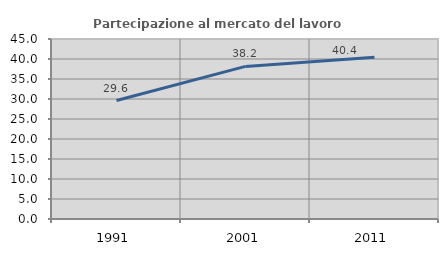
| Category | Partecipazione al mercato del lavoro  femminile |
|---|---|
| 1991.0 | 29.624 |
| 2001.0 | 38.15 |
| 2011.0 | 40.423 |